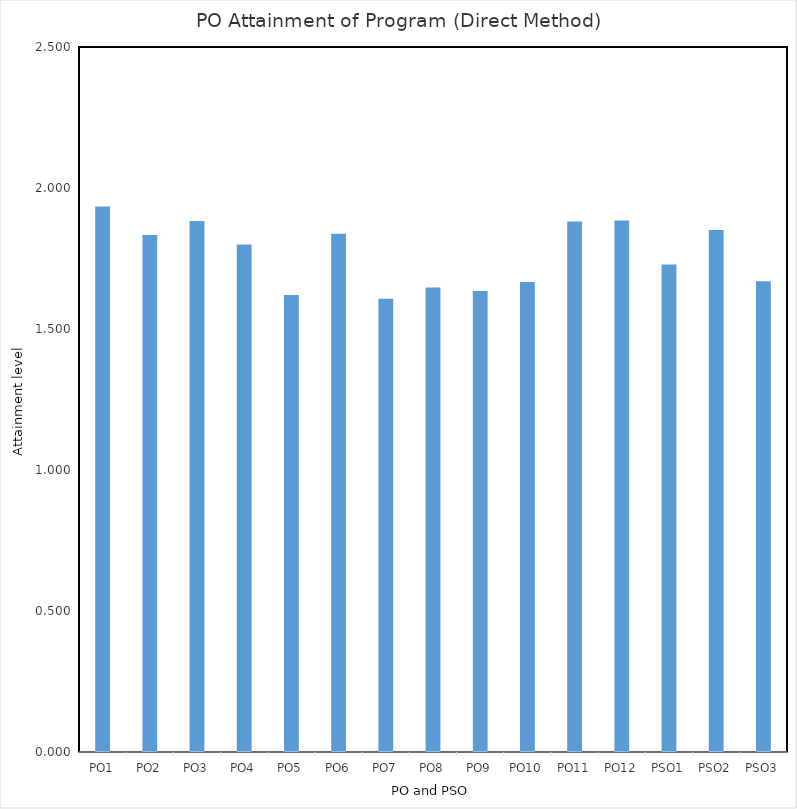
| Category | PO1 |
|---|---|
| PO1 | 1.935 |
| PO2 | 1.833 |
| PO3 | 1.883 |
| PO4 | 1.799 |
| PO5 | 1.62 |
| PO6 | 1.838 |
| PO7 | 1.607 |
| PO8 | 1.647 |
| PO9 | 1.635 |
| PO10 | 1.667 |
| PO11 | 1.882 |
| PO12 | 1.885 |
| PSO1 | 1.729 |
| PSO2 | 1.851 |
| PSO3 | 1.67 |